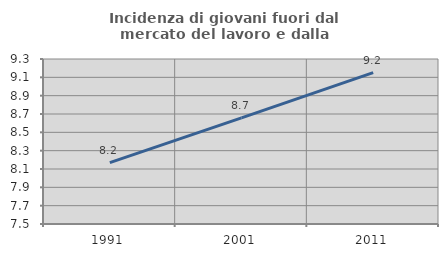
| Category | Incidenza di giovani fuori dal mercato del lavoro e dalla formazione  |
|---|---|
| 1991.0 | 8.169 |
| 2001.0 | 8.657 |
| 2011.0 | 9.152 |